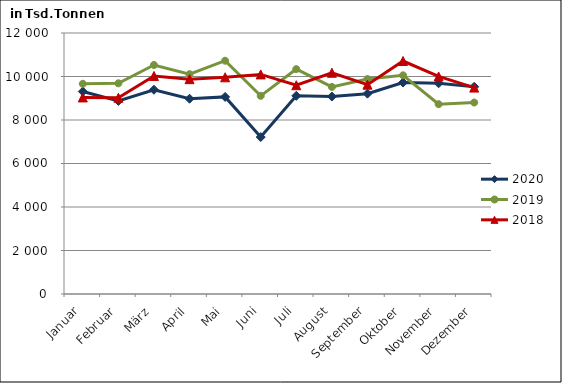
| Category | 2020 | 2019 | 2018 |
|---|---|---|---|
| Januar | 9310.02 | 9664.692 | 9036.869 |
| Februar | 8877.974 | 9686.28 | 9023.65 |
| März | 9391.369 | 10529.694 | 10025.552 |
| April | 8978.437 | 10107.696 | 9878.574 |
| Mai | 9062.759 | 10725.608 | 9963.671 |
| Juni | 7215.592 | 9110.591 | 10096.227 |
| Juli | 9111.226 | 10338.964 | 9599.26 |
| August | 9078.504 | 9520.82 | 10173.106 |
| September | 9211.016 | 9882.006 | 9624.038 |
| Oktober | 9721.742 | 10053.625 | 10711.911 |
| November | 9688.777 | 8728.663 | 10001.637 |
| Dezember | 9527.256 | 8803.67 | 9490.175 |